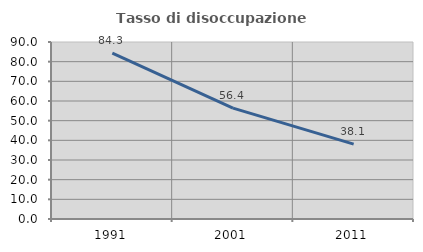
| Category | Tasso di disoccupazione giovanile  |
|---|---|
| 1991.0 | 84.314 |
| 2001.0 | 56.364 |
| 2011.0 | 38.095 |